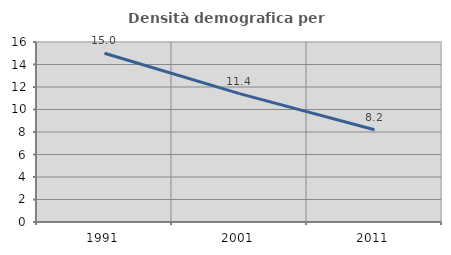
| Category | Densità demografica |
|---|---|
| 1991.0 | 15.002 |
| 2001.0 | 11.412 |
| 2011.0 | 8.202 |